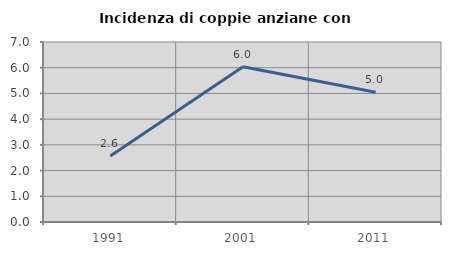
| Category | Incidenza di coppie anziane con figli |
|---|---|
| 1991.0 | 2.569 |
| 2001.0 | 6.04 |
| 2011.0 | 5.047 |